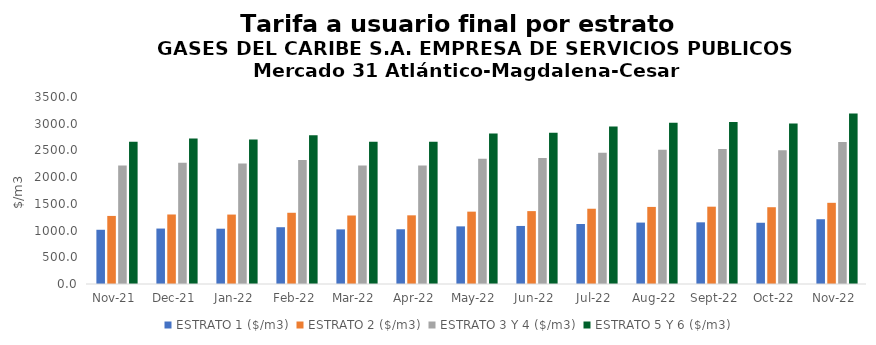
| Category | ESTRATO 1 ($/m3) | ESTRATO 2 ($/m3) | ESTRATO 3 Y 4 ($/m3) | ESTRATO 5 Y 6 ($/m3) |
|---|---|---|---|---|
| 2021-11-01 | 1015 | 1274.13 | 2217.49 | 2660.988 |
| 2021-12-01 | 1037.76 | 1301.16 | 2269.54 | 2723.448 |
| 2022-01-01 | 1034.96 | 1299.58 | 2255.09 | 2706.108 |
| 2022-02-01 | 1062.79 | 1333.18 | 2319.47 | 2783.364 |
| 2022-03-01 | 1022.16 | 1282.17 | 2218.76 | 2662.512 |
| 2022-04-01 | 1024.32 | 1285.33 | 2218.09 | 2661.708 |
| 2022-05-01 | 1078.73 | 1354.26 | 2345.47 | 2814.564 |
| 2022-06-01 | 1086.51 | 1364.12 | 2359 | 2830.8 |
| 2022-07-01 | 1123.27 | 1408.66 | 2455.61 | 2946.732 |
| 2022-08-01 | 1149.36 | 1442.77 | 2514.15 | 3016.98 |
| 2022-09-01 | 1154.32 | 1447.01 | 2525.28 | 3030.336 |
| 2022-10-01 | 1146.18 | 1437.12 | 2503.54 | 3004.248 |
| 2022-11-01 | 1212.06 | 1519.44 | 2658.31 | 3189.972 |